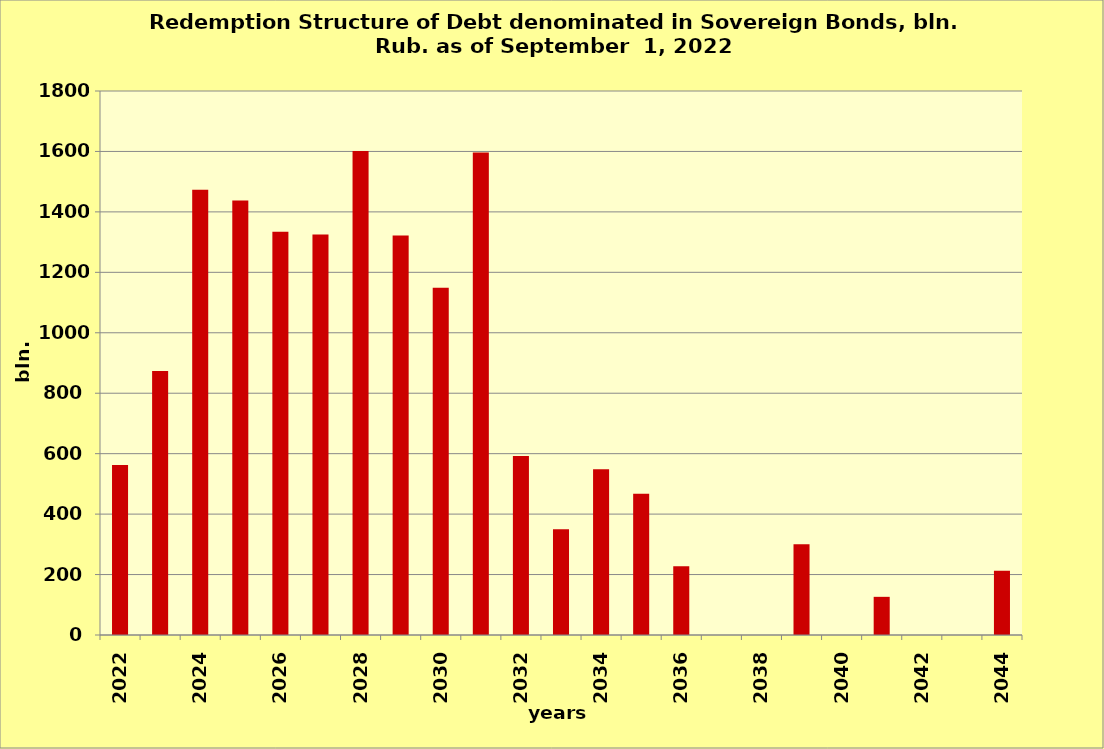
| Category | Series 0 |
|---|---|
| 2022 | 562.415 |
| 2023 | 873.636 |
| 2024 | 1473.1 |
| 2025 | 1437.746 |
| 2026 | 1334.561 |
| 2027 | 1324.833 |
| 2028 | 1601.756 |
| 2029 | 1321.585 |
| 2030 | 1148.809 |
| 2031 | 1596.903 |
| 2032 | 592.201 |
| 2033 | 350 |
| 2034 | 548.84 |
| 2035 | 467.105 |
| 2036 | 227.812 |
| 2037 | 0 |
| 2038 | 0 |
| 2039 | 300 |
| 2040 | 0 |
| 2041 | 126.269 |
| 2042 | 0 |
| 2043 | 0 |
| 2044 | 212.636 |